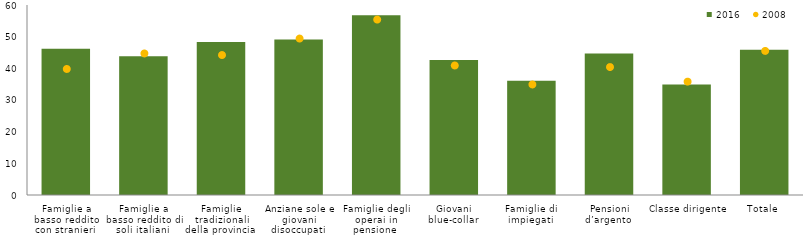
| Category | 2016 |
|---|---|
| Famiglie a basso reddito con stranieri  | 46.2 |
| Famiglie a basso reddito di soli italiani  | 43.8 |
| Famiglie tradizionali della provincia  | 48.3 |
| Anziane sole e giovani disoccupati  | 49.1 |
| Famiglie degli operai in pensione  | 56.8 |
| Giovani blue-collar  | 42.6 |
| Famiglie di impiegati  | 36.1 |
| Pensioni d’argento  | 44.7 |
| Classe dirigente  | 34.9 |
| Totale | 45.9 |